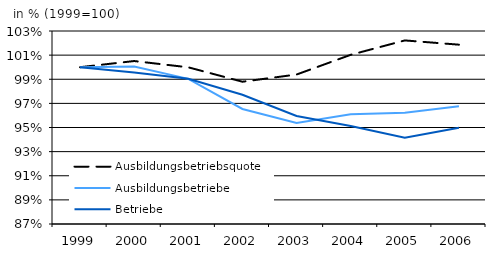
| Category | Ausbildungsbetriebsquote | Ausbildungsbetriebe | Betriebe |
|---|---|---|---|
| 1999.0 | 1 | 1 | 1 |
| 2000.0 | 1.005 | 1.001 | 0.995 |
| 2001.0 | 1 | 0.99 | 0.99 |
| 2002.0 | 0.988 | 0.965 | 0.977 |
| 2003.0 | 0.994 | 0.954 | 0.96 |
| 2004.0 | 1.01 | 0.961 | 0.951 |
| 2005.0 | 1.022 | 0.962 | 0.941 |
| 2006.0 | 1.019 | 0.968 | 0.95 |